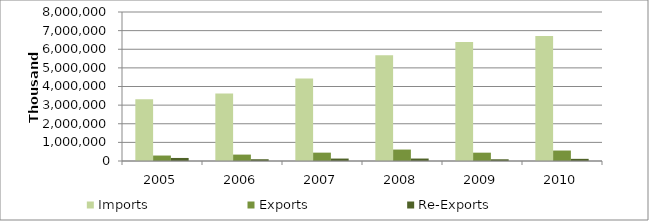
| Category | Imports | Exports | Re-Exports |
|---|---|---|---|
| 2005.0 | 3317478.898 | 293298.484 | 163206.216 |
| 2006.0 | 3627429 | 343956 | 94308 |
| 2007.0 | 4432513 | 448798 | 130883 |
| 2008.0 | 5679424.566 | 614155.626 | 131842.302 |
| 2009.0 | 6395952.867 | 447496.529 | 91690.708 |
| 2010.0 | 6705965.441 | 561997.471 | 115900.509 |